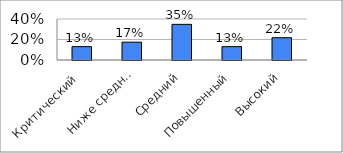
| Category | Series 0 |
|---|---|
| Критический  | 0.13 |
| Ниже среднего | 0.174 |
| Средний | 0.348 |
| Повышенный | 0.13 |
| Высокий | 0.217 |